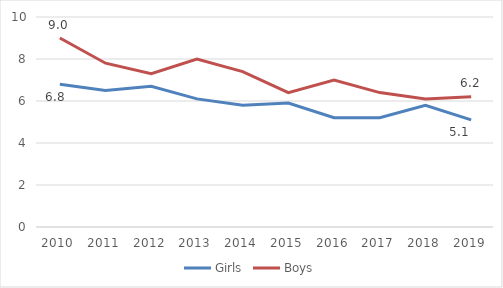
| Category | Girls | Boys |
|---|---|---|
| 2010.0 | 6.8 | 9 |
| 2011.0 | 6.5 | 7.8 |
| 2012.0 | 6.7 | 7.3 |
| 2013.0 | 6.1 | 8 |
| 2014.0 | 5.8 | 7.4 |
| 2015.0 | 5.9 | 6.4 |
| 2016.0 | 5.2 | 7 |
| 2017.0 | 5.2 | 6.4 |
| 2018.0 | 5.8 | 6.1 |
| 2019.0 | 5.1 | 6.2 |